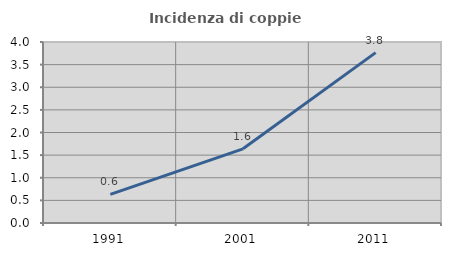
| Category | Incidenza di coppie miste |
|---|---|
| 1991.0 | 0.631 |
| 2001.0 | 1.639 |
| 2011.0 | 3.765 |